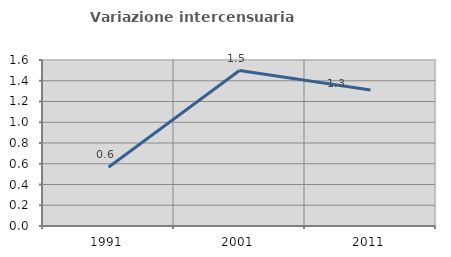
| Category | Variazione intercensuaria annua |
|---|---|
| 1991.0 | 0.566 |
| 2001.0 | 1.498 |
| 2011.0 | 1.311 |